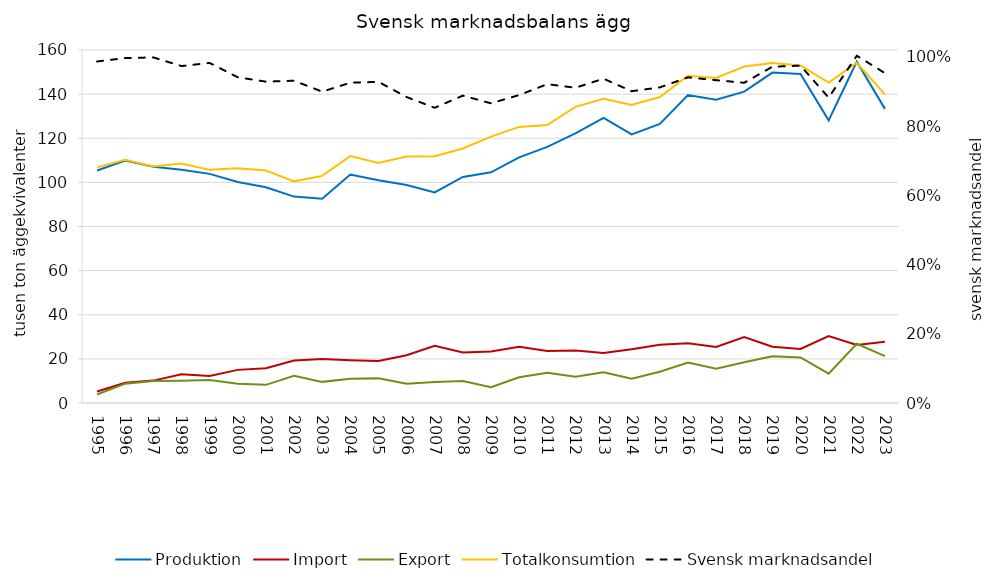
| Category | Produktion | Import | Export | Totalkonsumtion |
|---|---|---|---|---|
| 1995.0 | 105.38 | 5.248 | 3.842 | 106.786 |
| 1996.0 | 109.85 | 9.134 | 8.764 | 110.22 |
| 1997.0 | 107.08 | 10.152 | 10.004 | 107.228 |
| 1998.0 | 105.69 | 13.006 | 10.135 | 108.561 |
| 1999.0 | 103.85 | 12.268 | 10.447 | 105.671 |
| 2000.0 | 100.15 | 15.014 | 8.753 | 106.411 |
| 2001.0 | 97.81 | 15.748 | 8.222 | 105.336 |
| 2002.0 | 93.56 | 19.224 | 12.315 | 100.469 |
| 2003.0 | 92.6 | 19.91 | 9.579 | 102.931 |
| 2004.0 | 103.56 | 19.325 | 10.979 | 111.906 |
| 2005.0 | 100.96 | 18.994 | 11.161 | 108.793 |
| 2006.0 | 98.77 | 21.637 | 8.696 | 111.711 |
| 2007.0 | 95.43 | 25.974 | 9.533 | 111.871 |
| 2008.0 | 102.46 | 22.847 | 9.943 | 115.364 |
| 2009.0 | 104.54 | 23.315 | 7.14 | 120.715 |
| 2010.0 | 111.36 | 25.47 | 11.677 | 125.153 |
| 2011.0 | 116.08 | 23.607 | 13.684 | 126.003 |
| 2012.0 | 122.25 | 23.819 | 11.86 | 134.209 |
| 2013.0 | 129.25 | 22.639 | 13.96 | 137.929 |
| 2014.0 | 121.71 | 24.392 | 11.012 | 135.09 |
| 2015.0 | 126.504 | 26.386 | 14.178 | 138.712 |
| 2016.0 | 139.547 | 27.094 | 18.328 | 148.313 |
| 2017.0 | 137.435 | 25.4 | 15.5 | 147.335 |
| 2018.0 | 141.14 | 29.849 | 18.458 | 152.531 |
| 2019.0 | 149.77 | 25.512 | 21.145 | 154.137 |
| 2020.0 | 149.126 | 24.503 | 20.653 | 152.976 |
| 2021.0 | 128.126 | 30.382 | 13.303 | 145.205 |
| 2022.0 | 154.724 | 26.31 | 26.825 | 154.209 |
| 2023.0 | 133.31 | 27.757 | 21.215 | 139.852 |